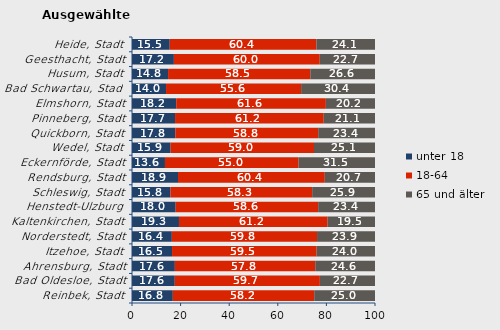
| Category | unter 18 | 18-64 | 65 und älter |
|---|---|---|---|
| Reinbek, Stadt | 16.803 | 58.186 | 25.011 |
| Bad Oldesloe, Stadt | 17.606 | 59.707 | 22.687 |
| Ahrensburg, Stadt | 17.639 | 57.782 | 24.579 |
| Itzehoe, Stadt | 16.477 | 59.511 | 24.013 |
| Norderstedt, Stadt | 16.396 | 59.753 | 23.851 |
| Kaltenkirchen, Stadt | 19.335 | 61.156 | 19.509 |
| Henstedt-Ulzburg | 17.971 | 58.641 | 23.387 |
| Schleswig, Stadt | 15.825 | 58.315 | 25.859 |
| Rendsburg, Stadt | 18.932 | 60.411 | 20.657 |
| Eckernförde, Stadt | 13.568 | 54.973 | 31.46 |
| Wedel, Stadt | 15.875 | 59.022 | 25.103 |
| Quickborn, Stadt | 17.83 | 58.804 | 23.366 |
| Pinneberg, Stadt | 17.713 | 61.187 | 21.1 |
| Elmshorn, Stadt | 18.201 | 61.577 | 20.222 |
| Bad Schwartau, Stadt | 14.006 | 55.586 | 30.407 |
| Husum, Stadt | 14.843 | 58.538 | 26.619 |
| Geesthacht, Stadt | 17.241 | 60.023 | 22.736 |
| Heide, Stadt | 15.538 | 60.36 | 24.102 |